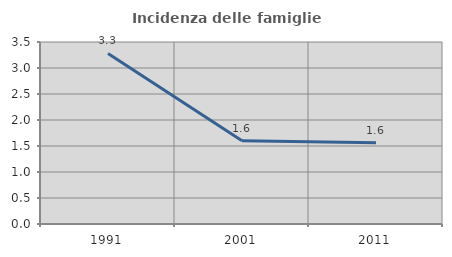
| Category | Incidenza delle famiglie numerose |
|---|---|
| 1991.0 | 3.28 |
| 2001.0 | 1.6 |
| 2011.0 | 1.564 |